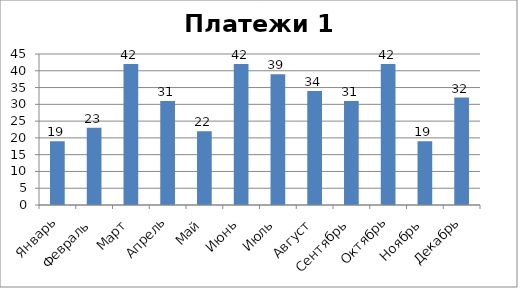
| Category | Клиент 1 |
|---|---|
| Январь | 19 |
| Февраль | 23 |
| Март | 42 |
| Апрель | 31 |
| Май | 22 |
| Июнь | 42 |
| Июль | 39 |
| Август | 34 |
| Сентябрь | 31 |
| Октябрь | 42 |
| Ноябрь | 19 |
| Декабрь | 32 |